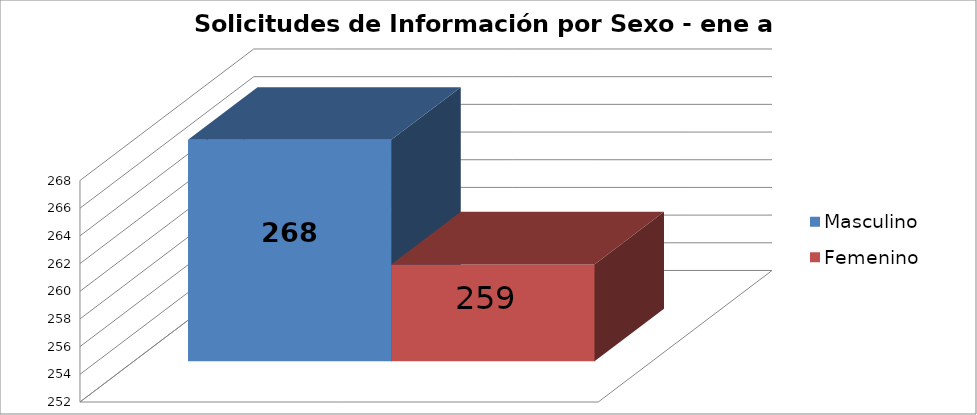
| Category | Masculino | Femenino |
|---|---|---|
| 0 | 268 | 259 |